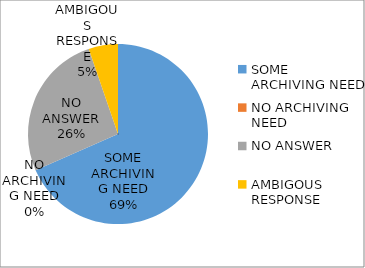
| Category | Series 0 |
|---|---|
| SOME ARCHIVING NEED | 0.684 |
| NO ARCHIVING NEED | 0 |
| NO ANSWER | 0.263 |
| AMBIGOUS RESPONSE | 0.053 |